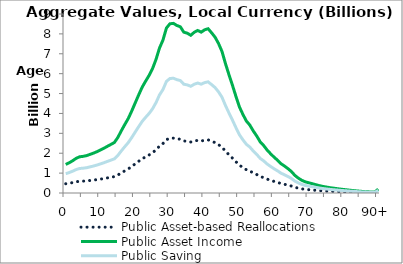
| Category | Public Asset-based Reallocations | Public Asset Income | Public Saving |
|---|---|---|---|
| 0 | 464.265 | 1435.359 | 971.093 |
|  | 491.598 | 1519.862 | 1028.264 |
| 2 | 524.783 | 1622.46 | 1097.677 |
| 3 | 563.611 | 1742.502 | 1178.892 |
| 4 | 589.275 | 1821.848 | 1232.573 |
| 5 | 595.918 | 1842.386 | 1246.468 |
| 6 | 607.639 | 1878.624 | 1270.985 |
| 7 | 628.134 | 1941.989 | 1313.855 |
| 8 | 648.508 | 2004.978 | 1356.47 |
| 9 | 671.957 | 2077.474 | 1405.517 |
| 10 | 699.114 | 2161.435 | 1462.321 |
| 11 | 728.097 | 2251.042 | 1522.945 |
| 12 | 759.326 | 2347.591 | 1588.265 |
| 13 | 789.728 | 2441.583 | 1651.856 |
| 14 | 821.126 | 2538.658 | 1717.532 |
| 15 | 902.919 | 2791.534 | 1888.615 |
| 16 | 1011.055 | 3125.857 | 2114.802 |
| 17 | 1113.159 | 3441.53 | 2328.371 |
| 18 | 1210.732 | 3743.194 | 2532.462 |
| 19 | 1332.67 | 4120.187 | 2787.517 |
| 20 | 1464.187 | 4526.794 | 3062.607 |
| 21 | 1594.581 | 4929.931 | 3335.35 |
| 22 | 1719.662 | 5316.642 | 3596.98 |
| 23 | 1818.387 | 5621.865 | 3803.479 |
| 24 | 1911.824 | 5910.743 | 3998.92 |
| 25 | 2023.89 | 6257.217 | 4233.327 |
| 26 | 2172.907 | 6717.929 | 4545.022 |
| 27 | 2357.04 | 7287.209 | 4930.169 |
| 28 | 2487.114 | 7689.355 | 5202.241 |
| 29 | 2683.013 | 8295.012 | 5611.999 |
| 30 | 2751.789 | 8507.644 | 5755.855 |
| 31 | 2758.735 | 8529.119 | 5770.384 |
| 32 | 2724.503 | 8423.285 | 5698.782 |
| 33 | 2703.315 | 8357.779 | 5654.464 |
| 34 | 2615.391 | 8085.948 | 5470.556 |
| 35 | 2598.705 | 8034.358 | 5435.653 |
| 36 | 2564.903 | 7929.855 | 5364.951 |
| 37 | 2613.938 | 8081.455 | 5467.517 |
| 38 | 2643.017 | 8171.356 | 5528.34 |
| 39 | 2615.996 | 8087.818 | 5471.822 |
| 40 | 2653.518 | 8203.822 | 5550.305 |
| 41 | 2671.544 | 8259.553 | 5588.009 |
| 42 | 2605.817 | 8056.348 | 5450.53 |
| 43 | 2534.283 | 7835.188 | 5300.904 |
| 44 | 2431.696 | 7518.021 | 5086.325 |
| 45 | 2301.357 | 7115.055 | 4813.698 |
| 46 | 2103.645 | 6503.793 | 4400.148 |
| 47 | 1924.933 | 5951.273 | 4026.34 |
| 48 | 1754.173 | 5423.339 | 3669.166 |
| 49 | 1573.657 | 4865.24 | 3291.583 |
| 50 | 1401.974 | 4334.452 | 2932.478 |
| 51 | 1280.481 | 3958.834 | 2678.353 |
| 52 | 1172.084 | 3623.708 | 2451.623 |
| 53 | 1105.248 | 3417.07 | 2311.822 |
| 54 | 1009.662 | 3121.551 | 2111.889 |
| 55 | 927.475 | 2867.453 | 1939.979 |
| 56 | 832.138 | 2572.704 | 1740.565 |
| 57 | 771.986 | 2386.731 | 1614.745 |
| 58 | 697.315 | 2155.872 | 1458.558 |
| 59 | 637.946 | 1972.324 | 1334.378 |
| 60 | 582.404 | 1800.607 | 1218.202 |
| 61 | 532.351 | 1645.857 | 1113.506 |
| 62 | 476.296 | 1472.555 | 996.258 |
| 63 | 438.124 | 1354.537 | 916.413 |
| 64 | 396.302 | 1225.239 | 828.937 |
| 65 | 348.724 | 1078.142 | 729.418 |
| 66 | 285.448 | 882.514 | 597.065 |
| 67 | 241.362 | 746.213 | 504.851 |
| 68 | 205.91 | 636.608 | 430.697 |
| 69 | 181.499 | 561.135 | 379.637 |
| 70 | 166.055 | 513.389 | 347.334 |
| 71 | 151.164 | 467.349 | 316.185 |
| 72 | 135.319 | 418.361 | 283.043 |
| 73 | 120.574 | 372.776 | 252.202 |
| 74 | 107.611 | 332.699 | 225.088 |
| 75 | 97.472 | 301.352 | 203.88 |
| 76 | 87.487 | 270.483 | 182.995 |
| 77 | 79.744 | 246.542 | 166.798 |
| 78 | 71.828 | 222.068 | 150.241 |
| 79 | 64.145 | 198.314 | 134.17 |
| 80 | 57.316 | 177.203 | 119.887 |
| 81 | 51.109 | 158.012 | 106.903 |
| 82 | 44.113 | 136.384 | 92.271 |
| 83 | 38.204 | 118.115 | 79.911 |
| 84 | 32.709 | 101.126 | 68.417 |
| 85 | 27.495 | 85.004 | 57.51 |
| 86 | 22.712 | 70.218 | 47.506 |
| 87 | 19.309 | 59.698 | 40.389 |
| 88 | 16.855 | 52.111 | 35.256 |
| 89 | 14.811 | 45.79 | 30.979 |
| 90+ | 62.839 | 194.279 | 131.439 |